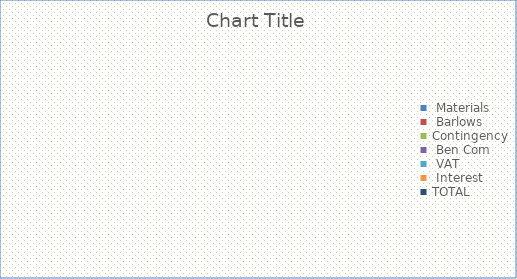
| Category | Series 0 |
|---|---|
|  Materials  | 0 |
|  Barlows  | 0 |
| Contingency | 0 |
|  Ben Com  | 0 |
|  VAT  | 0 |
|  Interest  | 0 |
| TOTAL | 0 |